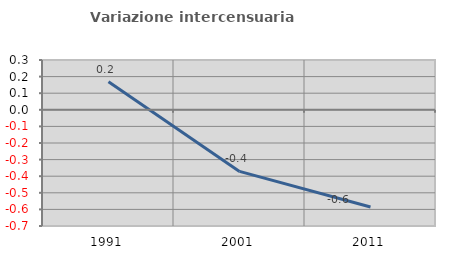
| Category | Variazione intercensuaria annua |
|---|---|
| 1991.0 | 0.169 |
| 2001.0 | -0.371 |
| 2011.0 | -0.585 |